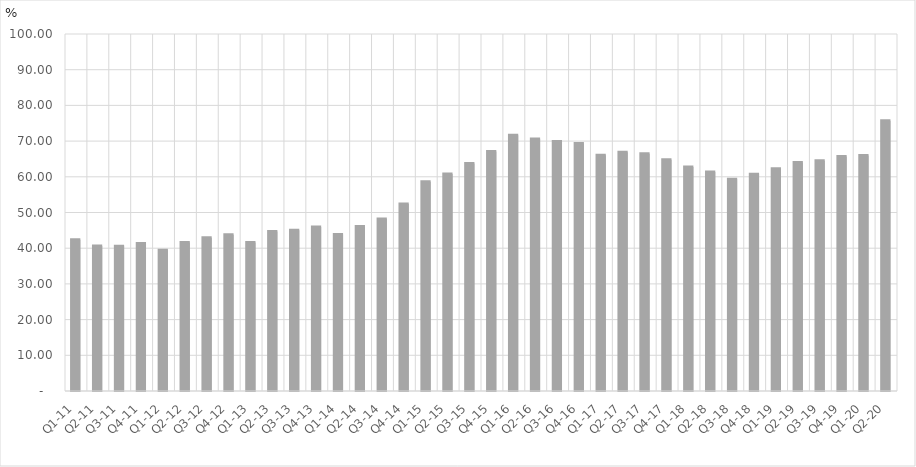
| Category | Percent of Total GDP |
|---|---|
| Q1-11 | 42.369 |
| Q2-11 | 40.601 |
| Q3-11 | 40.547 |
| Q4-11 | 41.329 |
| Q1-12 | 39.44 |
| Q2-12 | 41.604 |
| Q3-12 | 42.962 |
| Q4-12 | 43.796 |
| Q1-13 | 41.576 |
| Q2-13 | 44.693 |
| Q3-13 | 44.994 |
| Q4-13 | 45.912 |
| Q1-14 | 43.837 |
| Q2-14 | 46.044 |
| Q3-14 | 48.189 |
| Q4-14 | 52.383 |
| Q1-15 | 58.582 |
| Q2-15 | 60.762 |
| Q3-15 | 63.715 |
| Q4-15 | 67.099 |
| Q1-16 | 71.666 |
| Q2-16 | 70.553 |
| Q3-16 | 69.87 |
| Q4-16 | 69.293 |
| Q1-17 | 66.009 |
| Q2-17 | 66.843 |
| Q3-17 | 66.464 |
| Q4-17 | 64.772 |
| Q1-18 | 62.723 |
| Q2-18 | 61.368 |
| Q3-18 | 59.342 |
| Q4-18 | 60.743 |
| Q1-19 | 62.283 |
| Q2-19 | 63.973 |
| Q3-19 | 64.493 |
| Q4-19 | 65.67 |
| Q1-20 | 65.932 |
| Q2-20 | 75.674 |